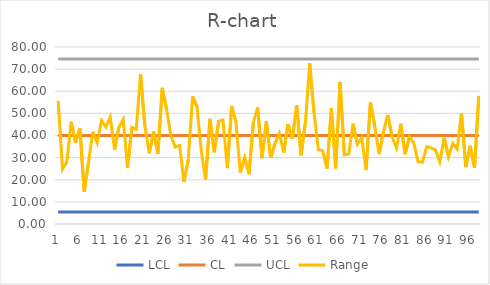
| Category | LCL | CL | UCL | Range |
|---|---|---|---|---|
| 0 | 5.44 | 40 | 74.56 | 55.705 |
| 1 | 5.44 | 40 | 74.56 | 24.76 |
| 2 | 5.44 | 40 | 74.56 | 28.014 |
| 3 | 5.44 | 40 | 74.56 | 46.238 |
| 4 | 5.44 | 40 | 74.56 | 36.758 |
| 5 | 5.44 | 40 | 74.56 | 43.32 |
| 6 | 5.44 | 40 | 74.56 | 14.575 |
| 7 | 5.44 | 40 | 74.56 | 27.985 |
| 8 | 5.44 | 40 | 74.56 | 41.66 |
| 9 | 5.44 | 40 | 74.56 | 36.755 |
| 10 | 5.44 | 40 | 74.56 | 46.722 |
| 11 | 5.44 | 40 | 74.56 | 43.809 |
| 12 | 5.44 | 40 | 74.56 | 48.307 |
| 13 | 5.44 | 40 | 74.56 | 33.635 |
| 14 | 5.44 | 40 | 74.56 | 43.747 |
| 15 | 5.44 | 40 | 74.56 | 47.323 |
| 16 | 5.44 | 40 | 74.56 | 25.345 |
| 17 | 5.44 | 40 | 74.56 | 43.683 |
| 18 | 5.44 | 40 | 74.56 | 42.821 |
| 19 | 5.44 | 40 | 74.56 | 67.775 |
| 20 | 5.44 | 40 | 74.56 | 44.221 |
| 21 | 5.44 | 40 | 74.56 | 31.962 |
| 22 | 5.44 | 40 | 74.56 | 41.764 |
| 23 | 5.44 | 40 | 74.56 | 31.668 |
| 24 | 5.44 | 40 | 74.56 | 61.532 |
| 25 | 5.44 | 40 | 74.56 | 51.885 |
| 26 | 5.44 | 40 | 74.56 | 39.785 |
| 27 | 5.44 | 40 | 74.56 | 34.807 |
| 28 | 5.44 | 40 | 74.56 | 35.551 |
| 29 | 5.44 | 40 | 74.56 | 18.97 |
| 30 | 5.44 | 40 | 74.56 | 29.205 |
| 31 | 5.44 | 40 | 74.56 | 57.656 |
| 32 | 5.44 | 40 | 74.56 | 53.063 |
| 33 | 5.44 | 40 | 74.56 | 33.052 |
| 34 | 5.44 | 40 | 74.56 | 20.145 |
| 35 | 5.44 | 40 | 74.56 | 47.504 |
| 36 | 5.44 | 40 | 74.56 | 32.456 |
| 37 | 5.44 | 40 | 74.56 | 46.439 |
| 38 | 5.44 | 40 | 74.56 | 47.033 |
| 39 | 5.44 | 40 | 74.56 | 25.294 |
| 40 | 5.44 | 40 | 74.56 | 53.298 |
| 41 | 5.44 | 40 | 74.56 | 46.139 |
| 42 | 5.44 | 40 | 74.56 | 23.256 |
| 43 | 5.44 | 40 | 74.56 | 30.079 |
| 44 | 5.44 | 40 | 74.56 | 22.444 |
| 45 | 5.44 | 40 | 74.56 | 45.711 |
| 46 | 5.44 | 40 | 74.56 | 52.697 |
| 47 | 5.44 | 40 | 74.56 | 29.777 |
| 48 | 5.44 | 40 | 74.56 | 46.41 |
| 49 | 5.44 | 40 | 74.56 | 29.887 |
| 50 | 5.44 | 40 | 74.56 | 36.333 |
| 51 | 5.44 | 40 | 74.56 | 41.018 |
| 52 | 5.44 | 40 | 74.56 | 32.274 |
| 53 | 5.44 | 40 | 74.56 | 45.166 |
| 54 | 5.44 | 40 | 74.56 | 38.6 |
| 55 | 5.44 | 40 | 74.56 | 53.604 |
| 56 | 5.44 | 40 | 74.56 | 31.022 |
| 57 | 5.44 | 40 | 74.56 | 45.758 |
| 58 | 5.44 | 40 | 74.56 | 72.728 |
| 59 | 5.44 | 40 | 74.56 | 50.26 |
| 60 | 5.44 | 40 | 74.56 | 33.552 |
| 61 | 5.44 | 40 | 74.56 | 33.079 |
| 62 | 5.44 | 40 | 74.56 | 24.896 |
| 63 | 5.44 | 40 | 74.56 | 52.374 |
| 64 | 5.44 | 40 | 74.56 | 25.131 |
| 65 | 5.44 | 40 | 74.56 | 64.158 |
| 66 | 5.44 | 40 | 74.56 | 31.22 |
| 67 | 5.44 | 40 | 74.56 | 31.698 |
| 68 | 5.44 | 40 | 74.56 | 45.335 |
| 69 | 5.44 | 40 | 74.56 | 36.024 |
| 70 | 5.44 | 40 | 74.56 | 39.002 |
| 71 | 5.44 | 40 | 74.56 | 24.353 |
| 72 | 5.44 | 40 | 74.56 | 55.055 |
| 73 | 5.44 | 40 | 74.56 | 44.424 |
| 74 | 5.44 | 40 | 74.56 | 31.585 |
| 75 | 5.44 | 40 | 74.56 | 41.491 |
| 76 | 5.44 | 40 | 74.56 | 49.293 |
| 77 | 5.44 | 40 | 74.56 | 39.365 |
| 78 | 5.44 | 40 | 74.56 | 34.405 |
| 79 | 5.44 | 40 | 74.56 | 45.288 |
| 80 | 5.44 | 40 | 74.56 | 31.562 |
| 81 | 5.44 | 40 | 74.56 | 39.39 |
| 82 | 5.44 | 40 | 74.56 | 36.564 |
| 83 | 5.44 | 40 | 74.56 | 28.048 |
| 84 | 5.44 | 40 | 74.56 | 27.959 |
| 85 | 5.44 | 40 | 74.56 | 35.031 |
| 86 | 5.44 | 40 | 74.56 | 34.339 |
| 87 | 5.44 | 40 | 74.56 | 33.424 |
| 88 | 5.44 | 40 | 74.56 | 28.176 |
| 89 | 5.44 | 40 | 74.56 | 38.958 |
| 90 | 5.44 | 40 | 74.56 | 30.407 |
| 91 | 5.44 | 40 | 74.56 | 36.453 |
| 92 | 5.44 | 40 | 74.56 | 33.846 |
| 93 | 5.44 | 40 | 74.56 | 50.144 |
| 94 | 5.44 | 40 | 74.56 | 25.696 |
| 95 | 5.44 | 40 | 74.56 | 35.333 |
| 96 | 5.44 | 40 | 74.56 | 25.375 |
| 97 | 5.44 | 40 | 74.56 | 57.891 |